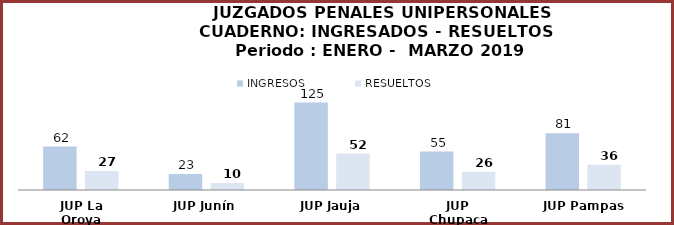
| Category | INGRESOS | RESUELTOS |
|---|---|---|
| JUP La Oroya | 62 | 27 |
| JUP Junín | 23 | 10 |
| JUP Jauja | 125 | 52 |
| JUP Chupaca | 55 | 26 |
| JUP Pampas | 81 | 36 |